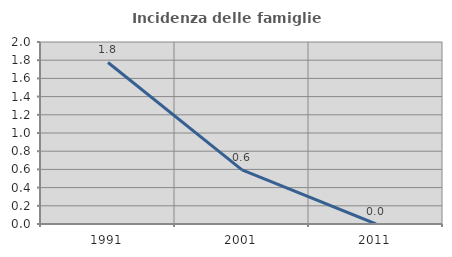
| Category | Incidenza delle famiglie numerose |
|---|---|
| 1991.0 | 1.775 |
| 2001.0 | 0.595 |
| 2011.0 | 0 |